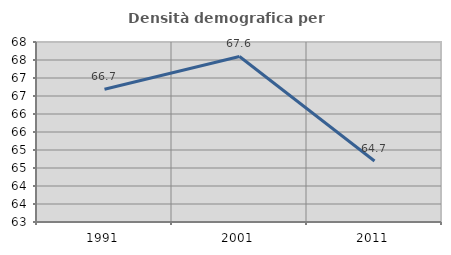
| Category | Densità demografica |
|---|---|
| 1991.0 | 66.685 |
| 2001.0 | 67.598 |
| 2011.0 | 64.694 |